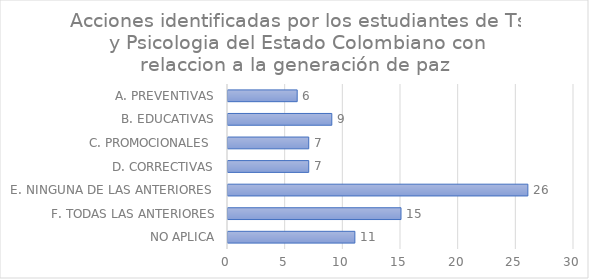
| Category | Series 0 |
|---|---|
| NO APLICA | 11 |
| F. TODAS LAS ANTERIORES | 15 |
| E. NINGUNA DE LAS ANTERIORES  | 26 |
| D. CORRECTIVAS | 7 |
| C. PROMOCIONALES  | 7 |
| B. EDUCATIVAS | 9 |
| A. PREVENTIVAS | 6 |